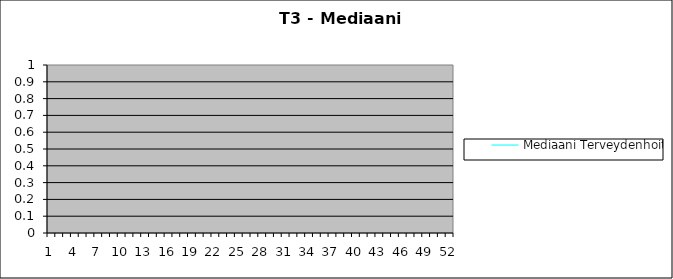
| Category | Mediaani Terveydenhoitaja |
|---|---|
| 0 | 0 |
| 1 | 0 |
| 2 | 0 |
| 3 | 0 |
| 4 | 0 |
| 5 | 0 |
| 6 | 0 |
| 7 | 0 |
| 8 | 0 |
| 9 | 0 |
| 10 | 0 |
| 11 | 0 |
| 12 | 0 |
| 13 | 0 |
| 14 | 0 |
| 15 | 0 |
| 16 | 0 |
| 17 | 0 |
| 18 | 0 |
| 19 | 0 |
| 20 | 0 |
| 21 | 0 |
| 22 | 0 |
| 23 | 0 |
| 24 | 0 |
| 25 | 0 |
| 26 | 0 |
| 27 | 0 |
| 28 | 0 |
| 29 | 0 |
| 30 | 0 |
| 31 | 0 |
| 32 | 0 |
| 33 | 0 |
| 34 | 0 |
| 35 | 0 |
| 36 | 0 |
| 37 | 0 |
| 38 | 0 |
| 39 | 0 |
| 40 | 0 |
| 41 | 0 |
| 42 | 0 |
| 43 | 0 |
| 44 | 0 |
| 45 | 0 |
| 46 | 0 |
| 47 | 0 |
| 48 | 0 |
| 49 | 0 |
| 50 | 0 |
| 51 | 0 |